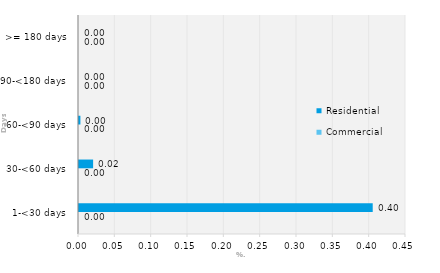
| Category | Commercial | Residential |
|---|---|---|
| 1-<30 days | 0 | 0.404 |
| 30-<60 days | 0 | 0.019 |
| 60-<90 days | 0 | 0.002 |
| 90-<180 days | 0 | 0 |
| >= 180 days | 0 | 0 |